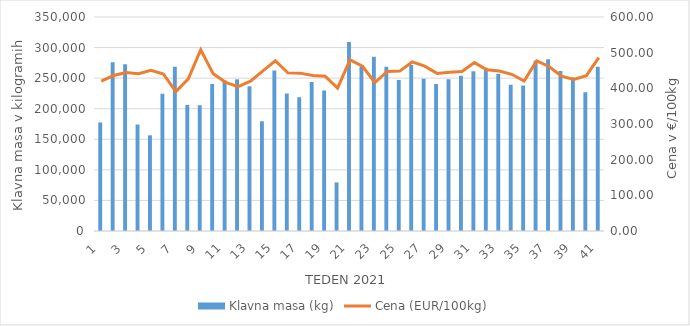
| Category | Klavna masa (kg) |
|---|---|
| 1.0 | 177573 |
| 2.0 | 275951 |
| 3.0 | 272797 |
| 4.0 | 174056 |
| 5.0 | 156508 |
| 6.0 | 224595 |
| 7.0 | 268436 |
| 8.0 | 206193 |
| 9.0 | 205669 |
| 10.0 | 240592 |
| 11.0 | 246325 |
| 12.0 | 248020 |
| 13.0 | 236703 |
| 14.0 | 179478 |
| 15.0 | 262544 |
| 16.0 | 225033 |
| 17.0 | 218950 |
| 18.0 | 243711 |
| 19.0 | 229955 |
| 20.0 | 79521 |
| 21.0 | 309134 |
| 22.0 | 268074 |
| 23.0 | 285151 |
| 24.0 | 268579 |
| 25.0 | 246944 |
| 26.0 | 271319 |
| 27.0 | 248858 |
| 28.0 | 240609 |
| 29.0 | 248383 |
| 30.0 | 253894 |
| 31.0 | 261374 |
| 32.0 | 267142 |
| 33.0 | 257352 |
| 34.0 | 239018 |
| 35.0 | 238034 |
| 36.0 | 278443 |
| 37.0 | 280772 |
| 38.0 | 261791 |
| 39.0 | 250972 |
| 40.0 | 226992 |
| 41.0 | 268523 |